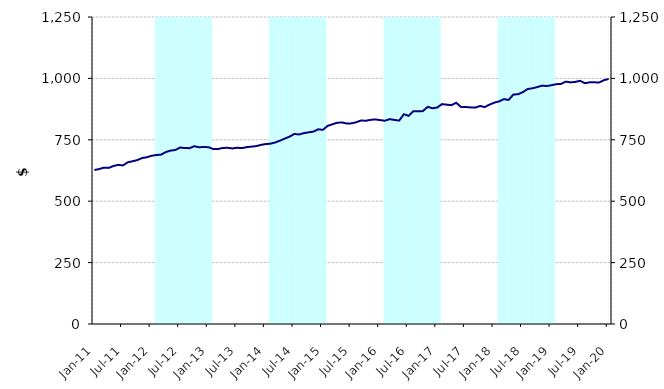
| Category | Series 1 |
|---|---|
| 2011-01-01 | 0 |
| 2011-02-01 | 0 |
| 2011-03-01 | 0 |
| 2011-04-01 | 0 |
| 2011-05-01 | 0 |
| 2011-06-01 | 0 |
| 2011-07-01 | 0 |
| 2011-08-01 | 0 |
| 2011-09-01 | 0 |
| 2011-10-01 | 0 |
| 2011-11-01 | 0 |
| 2011-12-01 | 0 |
| 2012-01-01 | 0 |
| 2012-02-01 | 1250000000 |
| 2012-03-01 | 1250000000 |
| 2012-04-01 | 1250000000 |
| 2012-05-01 | 1250000000 |
| 2012-06-01 | 1250000000 |
| 2012-07-01 | 1250000000 |
| 2012-08-01 | 1250000000 |
| 2012-09-01 | 1250000000 |
| 2012-10-01 | 1250000000 |
| 2012-11-01 | 1250000000 |
| 2012-12-01 | 1250000000 |
| 2013-01-01 | 1250000000 |
| 2013-02-01 | 0 |
| 2013-03-01 | 0 |
| 2013-04-01 | 0 |
| 2013-05-01 | 0 |
| 2013-06-01 | 0 |
| 2013-07-01 | 0 |
| 2013-08-01 | 0 |
| 2013-09-01 | 0 |
| 2013-10-01 | 0 |
| 2013-11-01 | 0 |
| 2013-12-01 | 0 |
| 2014-01-01 | 0 |
| 2014-02-01 | 1250000000 |
| 2014-03-01 | 1250000000 |
| 2014-04-01 | 1250000000 |
| 2014-05-01 | 1250000000 |
| 2014-06-01 | 1250000000 |
| 2014-07-01 | 1250000000 |
| 2014-08-01 | 1250000000 |
| 2014-09-01 | 1250000000 |
| 2014-10-01 | 1250000000 |
| 2014-11-01 | 1250000000 |
| 2014-12-01 | 1250000000 |
| 2015-01-01 | 1250000000 |
| 2015-02-01 | 0 |
| 2015-03-01 | 0 |
| 2015-04-01 | 0 |
| 2015-05-01 | 0 |
| 2015-06-01 | 0 |
| 2015-07-01 | 0 |
| 2015-08-01 | 0 |
| 2015-09-01 | 0 |
| 2015-10-01 | 0 |
| 2015-11-01 | 0 |
| 2015-12-01 | 0 |
| 2016-01-01 | 0 |
| 2016-02-01 | 1250000000 |
| 2016-03-01 | 1250000000 |
| 2016-04-01 | 1250000000 |
| 2016-05-01 | 1250000000 |
| 2016-06-01 | 1250000000 |
| 2016-07-01 | 1250000000 |
| 2016-08-01 | 1250000000 |
| 2016-09-01 | 1250000000 |
| 2016-10-01 | 1250000000 |
| 2016-11-01 | 1250000000 |
| 2016-12-01 | 1250000000 |
| 2017-01-01 | 1250000000 |
| 2017-02-01 | 0 |
| 2017-03-01 | 0 |
| 2017-04-01 | 0 |
| 2017-05-01 | 0 |
| 2017-06-01 | 0 |
| 2017-07-01 | 0 |
| 2017-08-01 | 0 |
| 2017-09-01 | 0 |
| 2017-10-01 | 0 |
| 2017-11-01 | 0 |
| 2017-12-01 | 0 |
| 2018-01-01 | 0 |
| 2018-02-01 | 1250000000 |
| 2018-03-01 | 1250000000 |
| 2018-04-01 | 1250000000 |
| 2018-05-01 | 1250000000 |
| 2018-06-01 | 1250000000 |
| 2018-07-01 | 1250000000 |
| 2018-08-01 | 1250000000 |
| 2018-09-01 | 1250000000 |
| 2018-10-01 | 1250000000 |
| 2018-11-01 | 1250000000 |
| 2018-12-01 | 1250000000 |
| 2019-01-01 | 1250000000 |
| 2019-02-01 | 0 |
| 2019-03-01 | 0 |
| 2019-04-01 | 0 |
| 2019-05-01 | 0 |
| 2019-06-01 | 0 |
| 2019-07-01 | 0 |
| 2019-08-01 | 0 |
| 2019-09-01 | 0 |
| 2019-10-01 | 0 |
| 2019-11-01 | 0 |
| 2019-12-01 | 0 |
| 2020-01-01 | 0 |